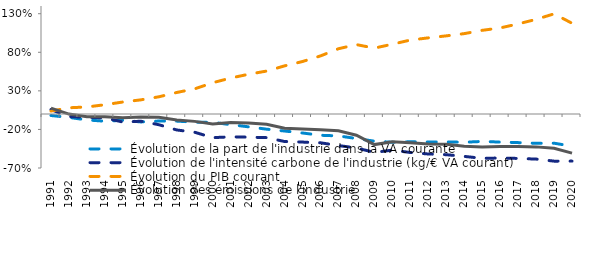
| Category | Évolution de la part de l'industrie dans la VA courante | Évolution de l'intensité carbone de l'industrie (kg/€ VA courant) | Évolution du PIB courant | Évolution des émissions de l'industrie |
|---|---|---|---|---|
| 1991.0 | -0.019 | 0.057 | 0.038 | 0.076 |
| 1992.0 | -0.044 | -0.033 | 0.081 | -0.001 |
| 1993.0 | -0.077 | -0.043 | 0.091 | -0.035 |
| 1994.0 | -0.093 | -0.05 | 0.12 | -0.036 |
| 1995.0 | -0.081 | -0.104 | 0.156 | -0.049 |
| 1996.0 | -0.103 | -0.094 | 0.183 | -0.038 |
| 1997.0 | -0.091 | -0.139 | 0.223 | -0.043 |
| 1998.0 | -0.092 | -0.207 | 0.279 | -0.079 |
| 1999.0 | -0.106 | -0.237 | 0.326 | -0.096 |
| 2000.0 | -0.108 | -0.307 | 0.405 | -0.131 |
| 2001.0 | -0.138 | -0.296 | 0.466 | -0.11 |
| 2002.0 | -0.166 | -0.3 | 0.515 | -0.116 |
| 2003.0 | -0.197 | -0.306 | 0.557 | -0.133 |
| 2004.0 | -0.22 | -0.357 | 0.624 | -0.185 |
| 2005.0 | -0.246 | -0.364 | 0.68 | -0.194 |
| 2006.0 | -0.276 | -0.373 | 0.753 | -0.204 |
| 2007.0 | -0.284 | -0.409 | 0.846 | -0.219 |
| 2008.0 | -0.318 | -0.44 | 0.899 | -0.275 |
| 2009.0 | -0.352 | -0.498 | 0.854 | -0.397 |
| 2010.0 | -0.366 | -0.468 | 0.905 | -0.358 |
| 2011.0 | -0.36 | -0.499 | 0.959 | -0.372 |
| 2012.0 | -0.362 | -0.518 | 0.987 | -0.389 |
| 2013.0 | -0.362 | -0.527 | 1.013 | -0.393 |
| 2014.0 | -0.366 | -0.55 | 1.042 | -0.417 |
| 2015.0 | -0.356 | -0.574 | 1.085 | -0.428 |
| 2016.0 | -0.364 | -0.571 | 1.116 | -0.422 |
| 2017.0 | -0.371 | -0.576 | 1.168 | -0.422 |
| 2018.0 | -0.38 | -0.584 | 1.227 | -0.426 |
| 2019.0 | -0.378 | -0.611 | 1.298 | -0.444 |
| 2020.0 | -0.418 | -0.611 | 1.176 | -0.507 |